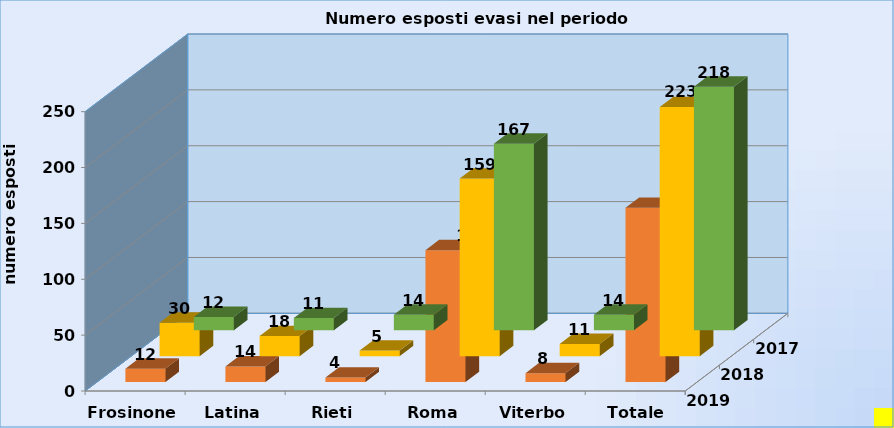
| Category | 2019 | 2018 | 2017 |
|---|---|---|---|
| Frosinone | 12 | 30 | 12 |
| Latina | 11 | 18 | 14 |
| Rieti | 14 | 5 | 4 |
| Roma | 167 | 159 | 118 |
| Viterbo | 14 | 11 | 8 |
| Totale Lazio | 218 | 223 | 156 |